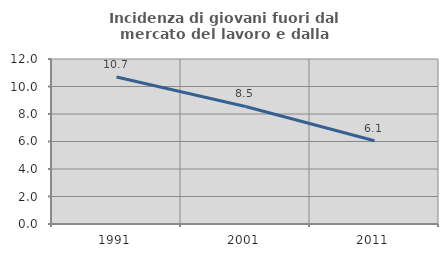
| Category | Incidenza di giovani fuori dal mercato del lavoro e dalla formazione  |
|---|---|
| 1991.0 | 10.691 |
| 2001.0 | 8.549 |
| 2011.0 | 6.054 |